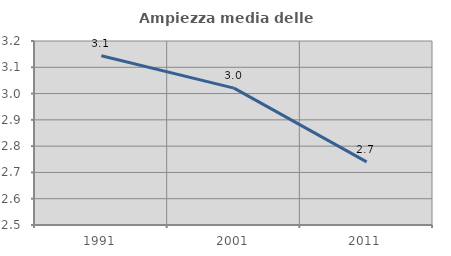
| Category | Ampiezza media delle famiglie |
|---|---|
| 1991.0 | 3.144 |
| 2001.0 | 3.021 |
| 2011.0 | 2.74 |